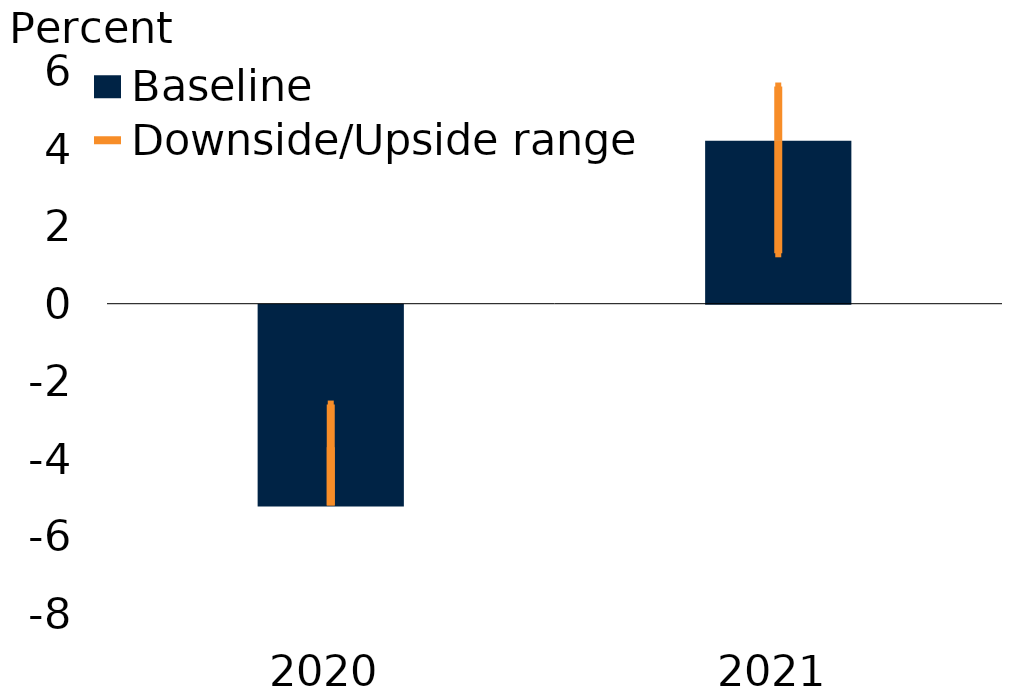
| Category | Baseline |
|---|---|
| 2020.0 | -5.2 |
| 2021.0 | 4.2 |